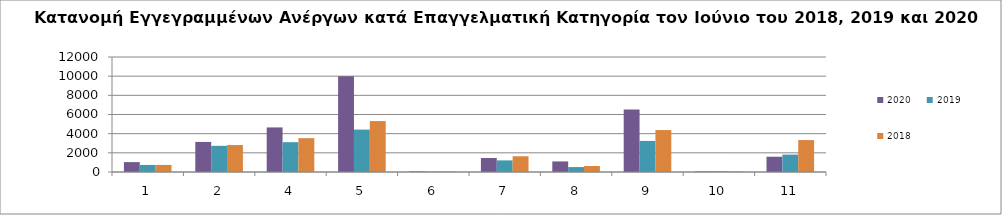
| Category | 2020 | 2019 | 2018 |
|---|---|---|---|
| 1.0 | 1033 | 736 | 739 |
| 2.0 | 3138 | 2731 | 2812 |
| 4.0 | 4651 | 3112 | 3530 |
| 5.0 | 9981 | 4425 | 5315 |
| 6.0 | 57 | 29 | 63 |
| 7.0 | 1463 | 1211 | 1641 |
| 8.0 | 1104 | 516 | 628 |
| 9.0 | 6510 | 3242 | 4376 |
| 10.0 | 56 | 68 | 66 |
| 11.0 | 1594 | 1813 | 3330 |